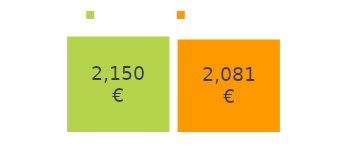
| Category | prihodki | odhodki |
|---|---|---|
| prihodki: | 2150 | 2081 |